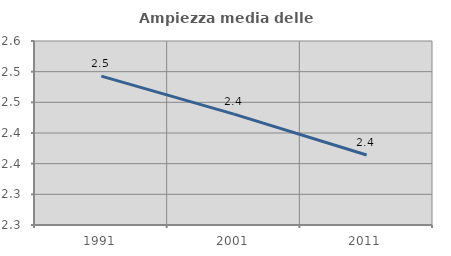
| Category | Ampiezza media delle famiglie |
|---|---|
| 1991.0 | 2.493 |
| 2001.0 | 2.431 |
| 2011.0 | 2.364 |